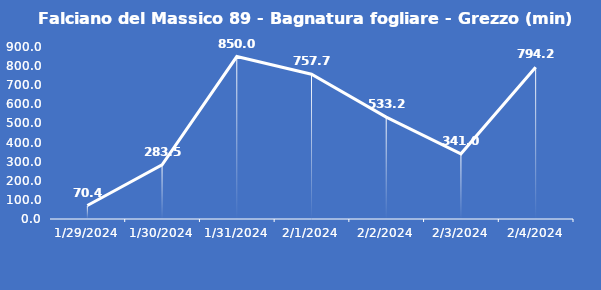
| Category | Falciano del Massico 89 - Bagnatura fogliare - Grezzo (min) |
|---|---|
| 1/29/24 | 70.4 |
| 1/30/24 | 283.5 |
| 1/31/24 | 850 |
| 2/1/24 | 757.7 |
| 2/2/24 | 533.2 |
| 2/3/24 | 341 |
| 2/4/24 | 794.2 |